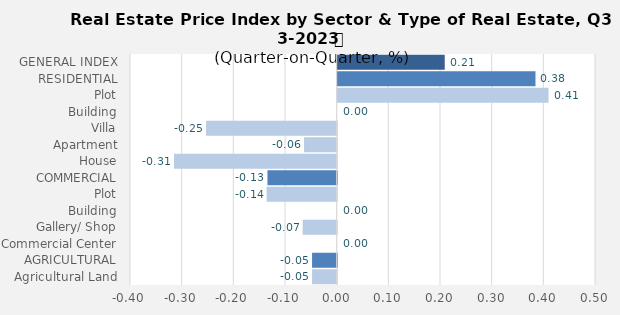
| Category | Q2-2023 |
|---|---|
| GENERAL INDEX | 0.207 |
| RESIDENTIAL | 0.383 |
| Plot | 0.408 |
| Building | 0 |
| Villa | -0.253 |
| Apartment | -0.063 |
| House | -0.315 |
| COMMERCIAL | -0.134 |
| Plot | -0.135 |
| Building | 0 |
| Gallery/ Shop | -0.066 |
| Commercial Center | 0 |
| AGRICULTURAL | -0.048 |
| Agricultural Land | -0.048 |